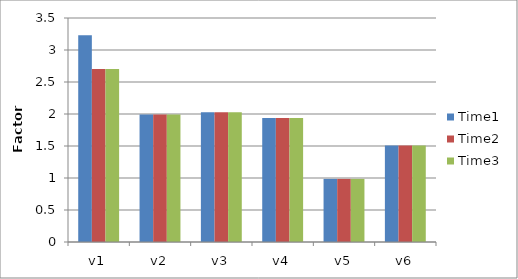
| Category | Time1 | Time2 | Time3 |
|---|---|---|---|
| v1 | 3.229 | 2.704 | 2.704 |
| v2 | 1.993 | 1.993 | 1.993 |
| v3 | 2.029 | 2.029 | 2.029 |
| v4 | 1.939 | 1.939 | 1.939 |
| v5 | 0.986 | 0.986 | 0.986 |
| v6 | 1.508 | 1.508 | 1.508 |